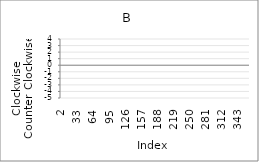
| Category | Series 0 |
|---|---|
| 2.0 | -4 |
| 3.0 | -3 |
| 4.0 | -1 |
| 5.0 | -5 |
| 6.0 | 1 |
| 7.0 | 3 |
| 8.0 | 4 |
| 9.0 | 4 |
| 10.0 | 3 |
| 11.0 | 3 |
| 12.0 | -5 |
| 13.0 | 1 |
| 14.0 | 3 |
| 15.0 | -2 |
| 16.0 | 1 |
| 17.0 | 4 |
| 18.0 | -3 |
| 19.0 | -3 |
| 20.0 | 3 |
| 21.0 | 4 |
| 22.0 | 0 |
| 23.0 | 3 |
| 24.0 | 4 |
| 25.0 | 2 |
| 26.0 | -2 |
| 27.0 | 1 |
| 28.0 | 2 |
| 29.0 | -3 |
| 30.0 | 1 |
| 31.0 | 99 |
| 32.0 | 99 |
| 33.0 | 99 |
| 34.0 | 99 |
| 35.0 | 99 |
| 36.0 | 99 |
| 37.0 | 99 |
| 38.0 | 99 |
| 39.0 | 99 |
| 40.0 | 99 |
| 41.0 | 99 |
| 42.0 | 99 |
| 43.0 | 99 |
| 44.0 | 99 |
| 45.0 | 99 |
| 46.0 | 99 |
| 47.0 | 99 |
| 48.0 | 99 |
| 49.0 | 99 |
| 50.0 | 99 |
| 51.0 | 99 |
| 52.0 | 99 |
| 53.0 | 99 |
| 54.0 | 99 |
| 55.0 | 99 |
| 56.0 | 99 |
| 57.0 | 99 |
| 58.0 | 99 |
| 59.0 | 99 |
| 60.0 | 99 |
| 61.0 | 99 |
| 62.0 | 99 |
| 63.0 | 99 |
| 64.0 | 99 |
| 65.0 | 99 |
| 66.0 | 99 |
| 67.0 | 99 |
| 68.0 | 99 |
| 69.0 | 99 |
| 70.0 | 99 |
| 71.0 | 99 |
| 72.0 | 99 |
| 73.0 | 99 |
| 74.0 | 99 |
| 75.0 | 99 |
| 76.0 | 99 |
| 77.0 | 99 |
| 78.0 | 99 |
| 79.0 | 99 |
| 80.0 | 99 |
| 81.0 | 99 |
| 82.0 | 99 |
| 83.0 | 99 |
| 84.0 | 99 |
| 85.0 | 99 |
| 86.0 | 99 |
| 87.0 | 99 |
| 88.0 | 99 |
| 89.0 | 99 |
| 90.0 | 99 |
| 91.0 | 99 |
| 92.0 | 99 |
| 93.0 | 99 |
| 94.0 | 99 |
| 95.0 | 99 |
| 96.0 | 99 |
| 97.0 | 99 |
| 98.0 | 99 |
| 99.0 | 99 |
| 100.0 | 99 |
| 101.0 | 99 |
| 102.0 | 99 |
| 103.0 | 99 |
| 104.0 | 99 |
| 105.0 | 99 |
| 106.0 | 99 |
| 107.0 | 99 |
| 108.0 | 99 |
| 109.0 | 99 |
| 110.0 | 99 |
| 111.0 | 99 |
| 112.0 | 99 |
| 113.0 | 99 |
| 114.0 | 99 |
| 115.0 | 99 |
| 116.0 | 99 |
| 117.0 | 99 |
| 118.0 | 99 |
| 119.0 | 99 |
| 120.0 | 99 |
| 121.0 | 99 |
| 122.0 | 99 |
| 123.0 | 99 |
| 124.0 | 99 |
| 125.0 | 99 |
| 126.0 | 99 |
| 127.0 | 99 |
| 128.0 | 99 |
| 129.0 | 99 |
| 130.0 | 99 |
| 131.0 | 99 |
| 132.0 | 99 |
| 133.0 | 99 |
| 134.0 | 99 |
| 135.0 | 99 |
| 136.0 | 99 |
| 137.0 | 99 |
| 138.0 | 99 |
| 139.0 | 99 |
| 140.0 | 99 |
| 141.0 | 99 |
| 142.0 | 99 |
| 143.0 | 99 |
| 144.0 | 99 |
| 145.0 | 99 |
| 146.0 | 99 |
| 147.0 | 99 |
| 148.0 | 99 |
| 149.0 | 99 |
| 150.0 | 99 |
| 151.0 | 99 |
| 152.0 | 99 |
| 153.0 | 99 |
| 154.0 | 99 |
| 155.0 | 99 |
| 156.0 | 99 |
| 157.0 | 99 |
| 158.0 | 99 |
| 159.0 | 99 |
| 160.0 | 99 |
| 161.0 | 99 |
| 162.0 | 99 |
| 163.0 | 99 |
| 164.0 | 99 |
| 165.0 | 99 |
| 166.0 | 99 |
| 167.0 | 99 |
| 168.0 | 99 |
| 169.0 | 99 |
| 170.0 | 99 |
| 171.0 | 99 |
| 172.0 | 99 |
| 173.0 | 99 |
| 174.0 | 99 |
| 175.0 | 99 |
| 176.0 | 99 |
| 177.0 | 99 |
| 178.0 | 99 |
| 179.0 | 99 |
| 180.0 | 99 |
| 181.0 | 99 |
| 182.0 | 99 |
| 183.0 | 99 |
| 184.0 | 99 |
| 185.0 | 99 |
| 186.0 | 99 |
| 187.0 | 99 |
| 188.0 | 99 |
| 189.0 | 99 |
| 190.0 | 99 |
| 191.0 | 99 |
| 192.0 | 99 |
| 193.0 | 99 |
| 194.0 | 99 |
| 195.0 | 99 |
| 196.0 | 99 |
| 197.0 | 99 |
| 198.0 | 99 |
| 199.0 | 99 |
| 200.0 | 99 |
| 201.0 | 99 |
| 202.0 | 99 |
| 203.0 | 99 |
| 204.0 | 99 |
| 205.0 | 99 |
| 206.0 | 99 |
| 207.0 | 99 |
| 208.0 | 99 |
| 209.0 | 99 |
| 210.0 | 99 |
| 211.0 | 99 |
| 212.0 | 99 |
| 213.0 | 99 |
| 214.0 | 99 |
| 215.0 | 99 |
| 216.0 | 99 |
| 217.0 | 99 |
| 218.0 | 99 |
| 219.0 | 99 |
| 220.0 | 99 |
| 221.0 | 99 |
| 222.0 | 99 |
| 223.0 | 99 |
| 224.0 | 99 |
| 225.0 | 99 |
| 226.0 | 99 |
| 227.0 | 99 |
| 228.0 | 99 |
| 229.0 | 99 |
| 230.0 | 99 |
| 231.0 | 99 |
| 232.0 | 99 |
| 233.0 | 99 |
| 234.0 | 99 |
| 235.0 | 99 |
| 236.0 | 99 |
| 237.0 | 99 |
| 238.0 | 99 |
| 239.0 | 99 |
| 240.0 | 99 |
| 241.0 | 99 |
| 242.0 | 99 |
| 243.0 | 99 |
| 244.0 | 99 |
| 245.0 | 99 |
| 246.0 | 99 |
| 247.0 | 99 |
| 248.0 | 99 |
| 249.0 | 99 |
| 250.0 | 99 |
| 251.0 | 99 |
| 252.0 | 99 |
| 253.0 | 99 |
| 254.0 | 99 |
| 255.0 | 99 |
| 256.0 | 99 |
| 257.0 | 99 |
| 258.0 | 99 |
| 259.0 | 99 |
| 260.0 | 99 |
| 261.0 | 99 |
| 262.0 | 99 |
| 263.0 | 99 |
| 264.0 | 99 |
| 265.0 | 99 |
| 266.0 | 99 |
| 267.0 | 99 |
| 268.0 | 99 |
| 269.0 | 99 |
| 270.0 | 99 |
| 271.0 | 99 |
| 272.0 | 99 |
| 273.0 | 99 |
| 274.0 | 99 |
| 275.0 | 99 |
| 276.0 | 99 |
| 277.0 | 99 |
| 278.0 | 99 |
| 279.0 | 99 |
| 280.0 | 99 |
| 281.0 | 99 |
| 282.0 | 99 |
| 283.0 | 99 |
| 284.0 | 99 |
| 285.0 | 99 |
| 286.0 | 99 |
| 287.0 | 99 |
| 288.0 | 99 |
| 289.0 | 99 |
| 290.0 | 99 |
| 291.0 | 99 |
| 292.0 | 99 |
| 293.0 | 99 |
| 294.0 | 99 |
| 295.0 | 99 |
| 296.0 | 99 |
| 297.0 | 99 |
| 298.0 | 99 |
| 299.0 | 99 |
| 300.0 | 99 |
| 301.0 | 99 |
| 302.0 | 99 |
| 303.0 | 99 |
| 304.0 | 99 |
| 305.0 | 99 |
| 306.0 | 99 |
| 307.0 | 99 |
| 308.0 | 99 |
| 309.0 | 99 |
| 310.0 | 99 |
| 311.0 | 99 |
| 312.0 | 99 |
| 313.0 | 99 |
| 314.0 | 99 |
| 315.0 | 99 |
| 316.0 | 99 |
| 317.0 | 99 |
| 318.0 | 99 |
| 319.0 | 99 |
| 320.0 | 99 |
| 321.0 | 99 |
| 322.0 | 99 |
| 323.0 | 99 |
| 324.0 | 99 |
| 325.0 | 99 |
| 326.0 | 99 |
| 327.0 | 99 |
| 328.0 | 99 |
| 329.0 | 99 |
| 330.0 | 99 |
| 331.0 | 99 |
| 332.0 | 99 |
| 333.0 | 99 |
| 334.0 | 99 |
| 335.0 | 99 |
| 336.0 | 99 |
| 337.0 | 99 |
| 338.0 | 99 |
| 339.0 | 99 |
| 340.0 | 99 |
| 341.0 | 99 |
| 342.0 | 99 |
| 343.0 | 99 |
| 344.0 | 99 |
| 345.0 | 99 |
| 346.0 | 99 |
| 347.0 | 99 |
| 348.0 | 99 |
| 349.0 | 99 |
| 350.0 | 99 |
| 351.0 | 99 |
| 352.0 | 99 |
| 353.0 | 99 |
| 354.0 | 99 |
| 355.0 | 99 |
| 356.0 | 99 |
| 357.0 | 99 |
| 358.0 | 99 |
| 359.0 | 99 |
| 360.0 | 99 |
| 361.0 | 99 |
| 362.0 | 99 |
| 363.0 | 99 |
| 364.0 | 99 |
| 365.0 | 99 |